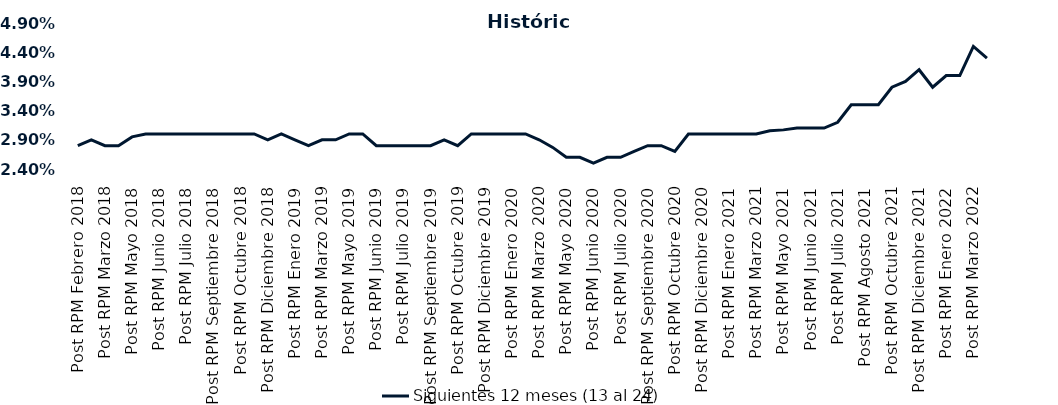
| Category | Siguientes 12 meses (13 al 24)  |
|---|---|
| Post RPM Febrero 2018 | 0.028 |
| Pre RPM Marzo 2018 | 0.029 |
| Post RPM Marzo 2018 | 0.028 |
| Pre RPM Mayo 2018 | 0.028 |
| Post RPM Mayo 2018 | 0.03 |
| Pre RPM Junio 2018 | 0.03 |
| Post RPM Junio 2018 | 0.03 |
| Pre RPM Julio 2018 | 0.03 |
| Post RPM Julio 2018 | 0.03 |
| Pre RPM Septiembre 2018 | 0.03 |
| Post RPM Septiembre 2018 | 0.03 |
| Pre RPM Octubre 2018 | 0.03 |
| Post RPM Octubre 2018 | 0.03 |
| Pre RPM Diciembre 2018 | 0.03 |
| Post RPM Diciembre 2018 | 0.029 |
| Pre RPM Enero 2019 | 0.03 |
| Post RPM Enero 2019 | 0.029 |
| Pre RPM Marzo 2019 | 0.028 |
| Post RPM Marzo 2019 | 0.029 |
| Pre RPM Mayo 2019 | 0.029 |
| Post RPM Mayo 2019 | 0.03 |
| Pre RPM Junio 2019 | 0.03 |
| Post RPM Junio 2019 | 0.028 |
| Pre RPM Julio 2019 | 0.028 |
| Post RPM Julio 2019 | 0.028 |
| Pre RPM Septiembre 2019 | 0.028 |
| Post RPM Septiembre 2019 | 0.028 |
| Pre RPM Octubre 2019 | 0.029 |
| Post RPM Octubre 2019 | 0.028 |
| Pre RPM Diciembre 2019 | 0.03 |
| Post RPM Diciembre 2019 | 0.03 |
| Pre RPM Enero 2020 | 0.03 |
| Post RPM Enero 2020 | 0.03 |
| Pre RPM Marzo 2020 | 0.03 |
| Post RPM Marzo 2020 | 0.029 |
| Pre RPM Mayo 2020 | 0.028 |
| Post RPM Mayo 2020 | 0.026 |
| Pre RPM Junio 2020 | 0.026 |
| Post RPM Junio 2020 | 0.025 |
| Pre RPM Julio 2020 | 0.026 |
| Post RPM Julio 2020 | 0.026 |
| Pre RPM Septiembre 2020 | 0.027 |
| Post RPM Septiembre 2020 | 0.028 |
| Pre RPM Octubre 2020 | 0.028 |
| Post RPM Octubre 2020 | 0.027 |
| Pre RPM Diciembre 2020 | 0.03 |
| Post RPM Diciembre 2020 | 0.03 |
| Pre RPM Enero 2021 | 0.03 |
| Post RPM Enero 2021 | 0.03 |
| Pre RPM Marzo 2021 | 0.03 |
| Post RPM Marzo 2021 | 0.03 |
| Pre RPM Mayo 2021 | 0.031 |
| Post RPM Mayo 2021 | 0.031 |
| Pre RPM Junio 2021 | 0.031 |
| Post RPM Junio 2021 | 0.031 |
| Pre RPM Julio 2021 | 0.031 |
| Post RPM Julio 2021 | 0.032 |
| Pre RPM Agosto 2021 | 0.035 |
| Post RPM Agosto 2021 | 0.035 |
| Pre RPM Octubre 2021 | 0.035 |
| Post RPM Octubre 2021 | 0.038 |
| Pre RPM Diciembre 2021 | 0.039 |
| Post RPM Diciembre 2021 | 0.041 |
| Pre RPM Enero 2022 | 0.038 |
| Post RPM Enero 2022 | 0.04 |
| Pre RPM Marzo 2022 | 0.04 |
| Post RPM Marzo 2022 | 0.045 |
| Pre RPM Mayo 2022 | 0.043 |